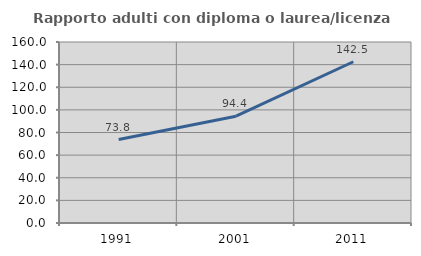
| Category | Rapporto adulti con diploma o laurea/licenza media  |
|---|---|
| 1991.0 | 73.811 |
| 2001.0 | 94.384 |
| 2011.0 | 142.531 |